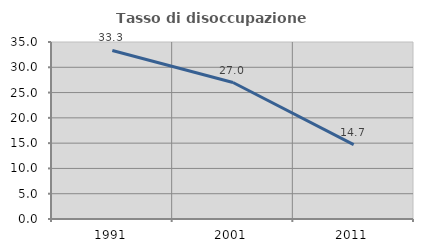
| Category | Tasso di disoccupazione giovanile  |
|---|---|
| 1991.0 | 33.333 |
| 2001.0 | 26.984 |
| 2011.0 | 14.706 |